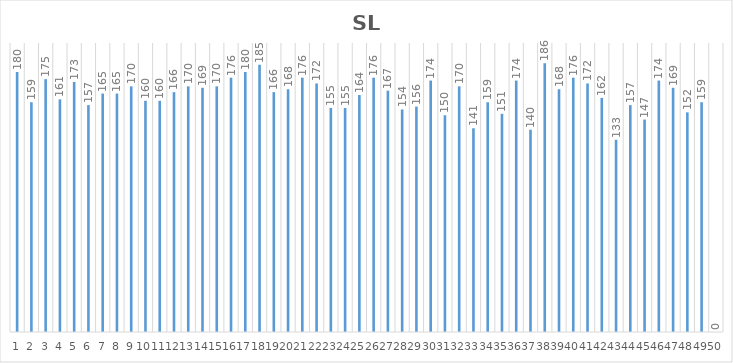
| Category | Series 0 |
|---|---|
| 0 | 180 |
| 1 | 159 |
| 2 | 175 |
| 3 | 161 |
| 4 | 173 |
| 5 | 157 |
| 6 | 165 |
| 7 | 165 |
| 8 | 170 |
| 9 | 160 |
| 10 | 160 |
| 11 | 166 |
| 12 | 170 |
| 13 | 169 |
| 14 | 170 |
| 15 | 176 |
| 16 | 180 |
| 17 | 185 |
| 18 | 166 |
| 19 | 168 |
| 20 | 176 |
| 21 | 172 |
| 22 | 155 |
| 23 | 155 |
| 24 | 164 |
| 25 | 176 |
| 26 | 167 |
| 27 | 154 |
| 28 | 156 |
| 29 | 174 |
| 30 | 150 |
| 31 | 170 |
| 32 | 141 |
| 33 | 159 |
| 34 | 151 |
| 35 | 174 |
| 36 | 140 |
| 37 | 186 |
| 38 | 168 |
| 39 | 176 |
| 40 | 172 |
| 41 | 162 |
| 42 | 133 |
| 43 | 157 |
| 44 | 147 |
| 45 | 174 |
| 46 | 169 |
| 47 | 152 |
| 48 | 159 |
| 49 | 0 |